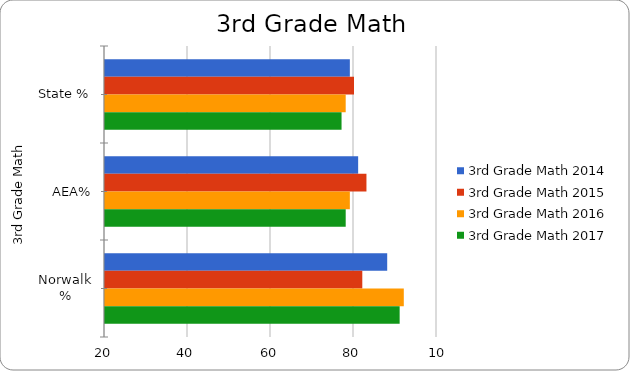
| Category | 3rd Grade Math 2014 | 3rd Grade Math 2015 | 3rd Grade Math 2016 | 3rd Grade Math 2017 |
|---|---|---|---|---|
| State % | 79 | 80 | 78 | 77 |
| AEA% | 81 | 83 | 79 | 78 |
| Norwalk % | 88 | 82 | 92 | 91 |